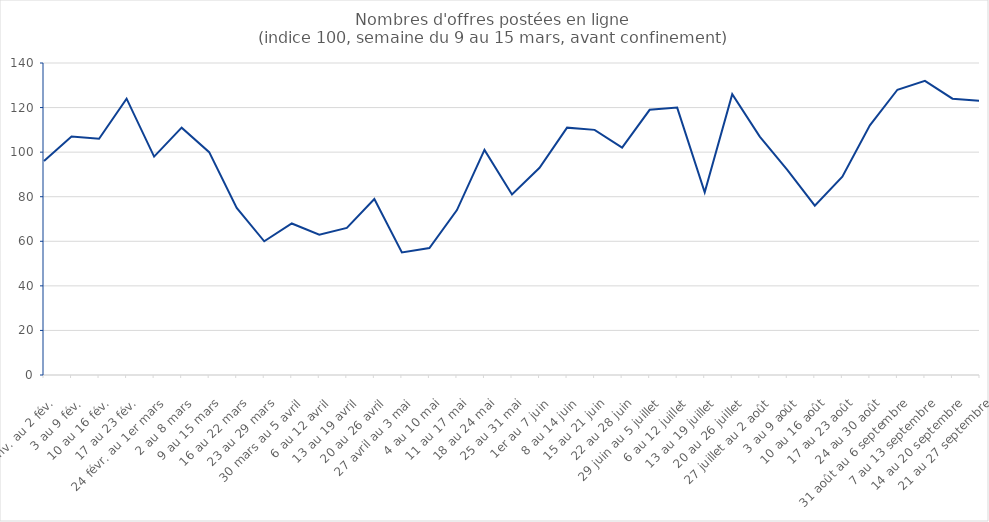
| Category | Series 0 |
|---|---|
| 27 janv. au 2 fév. | 96 |
| 3 au 9 fév. | 107 |
| 10 au 16 fév. | 106 |
| 17 au 23 fév. | 124 |
| 24 févr. au 1er mars | 98 |
| 2 au 8 mars | 111 |
| 9 au 15 mars | 100 |
| 16 au 22 mars | 75 |
| 23 au 29 mars | 60 |
| 30 mars au 5 avril | 68 |
| 6 au 12 avril | 63 |
| 13 au 19 avril | 66 |
| 20 au 26 avril | 79 |
| 27 avril au 3 mai | 55 |
| 4 au 10 mai | 57 |
| 11 au 17 mai | 74 |
| 18 au 24 mai | 101 |
| 25 au 31 mai | 81 |
| 1er au 7 juin | 93 |
| 8 au 14 juin | 111 |
| 15 au 21 juin | 110 |
| 22 au 28 juin | 102 |
| 29 juin au 5 juillet | 119 |
| 6 au 12 juillet | 120 |
| 13 au 19 juillet | 82 |
| 20 au 26 juillet | 126 |
| 27 juillet au 2 août | 107 |
| 3 au 9 août | 92 |
| 10 au 16 août | 76 |
| 17 au 23 août | 89 |
| 24 au 30 août | 112 |
| 31 août au 6 septembre | 128 |
| 7 au 13 septembre | 132 |
| 14 au 20 septembre | 124 |
| 21 au 27 septembre | 123 |